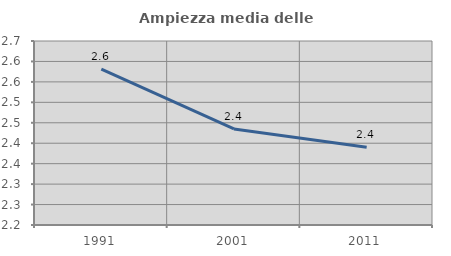
| Category | Ampiezza media delle famiglie |
|---|---|
| 1991.0 | 2.581 |
| 2001.0 | 2.435 |
| 2011.0 | 2.39 |